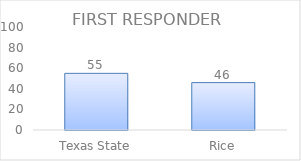
| Category | Series 0 |
|---|---|
| Texas State | 55 |
| Rice | 46 |